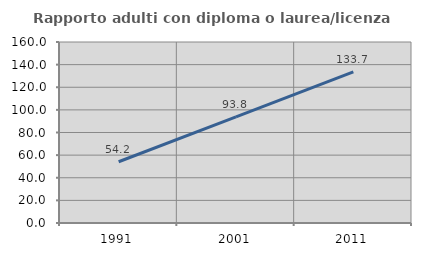
| Category | Rapporto adulti con diploma o laurea/licenza media  |
|---|---|
| 1991.0 | 54.167 |
| 2001.0 | 93.75 |
| 2011.0 | 133.654 |